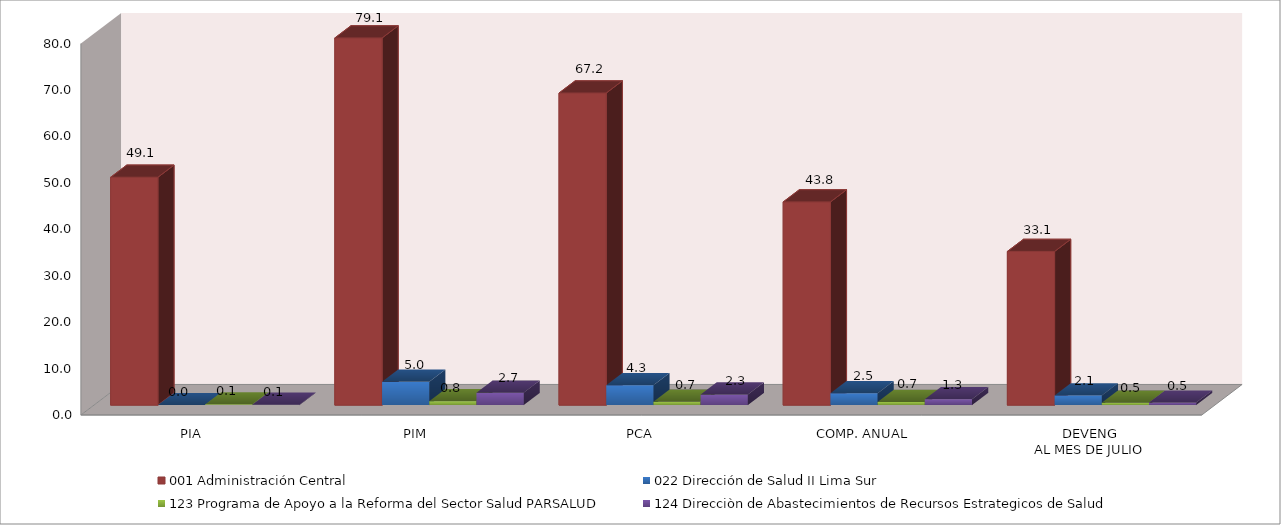
| Category | 001 Administración Central | 022 Dirección de Salud II Lima Sur | 123 Programa de Apoyo a la Reforma del Sector Salud PARSALUD | 124 Direcciòn de Abastecimientos de Recursos Estrategicos de Salud |
|---|---|---|---|---|
| PIA | 49.074 | 0 | 0.136 | 0.1 |
| PIM | 79.074 | 5.044 | 0.836 | 2.666 |
| PCA | 67.213 | 4.287 | 0.711 | 2.266 |
| COMP. ANUAL | 43.762 | 2.535 | 0.685 | 1.259 |
| DEVENG
AL MES DE JULIO | 33.096 | 2.079 | 0.493 | 0.538 |